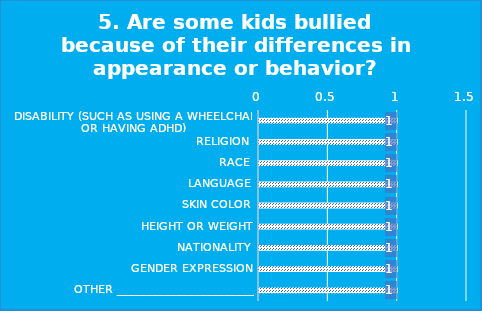
| Category | Field1 |
|---|---|
| Disability (such as using a wheelchair or having ADHD) | 1 |
| Religion | 1 |
| Race | 1 |
| Language | 1 |
| Skin color | 1 |
| Height or weight | 1 |
| Nationality | 1 |
| Gender expression | 1 |
| Other _________________________ | 1 |